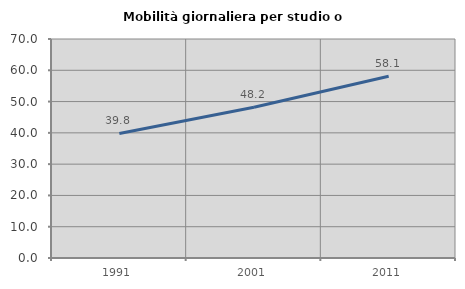
| Category | Mobilità giornaliera per studio o lavoro |
|---|---|
| 1991.0 | 39.799 |
| 2001.0 | 48.161 |
| 2011.0 | 58.092 |